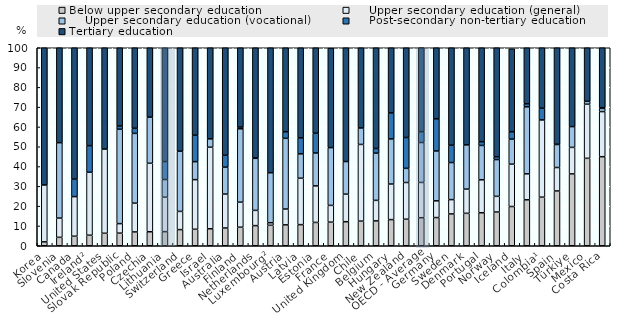
| Category | Below upper secondary education |     Upper secondary education (general) |     Upper secondary education (vocational) |     Post-secondary non-tertiary education | Tertiary education |
|---|---|---|---|---|---|
| Korea | 1.968 | 28.743 | 0 | 0 | 69.289 |
| Slovenia | 4.25 | 9.73 | 38.07 | 0 | 47.95 |
| Canada | 4.809 | 20.008 | 0 | 8.826 | 66.358 |
| Ireland² | 5.316 | 31.799 | 0 | 13.446 | 62.885 |
| United States | 6.298 | 42.535 | 0 | 0 | 51.168 |
| Slovak Republic | 6.364 | 4.807 | 47.673 | 1.658 | 39.497 |
| Poland | 6.981 | 14.524 | 35.243 | 2.607 | 40.645 |
| Czechia | 7.07 | 34.595 | 23.296 | 0 | 35.039 |
| Lithuania | 7.128 | 17.396 | 8.92 | 9.077 | 57.479 |
| Switzerland | 8.158 | 9.188 | 30.383 | 0 | 52.271 |
| Greece | 8.32 | 25.066 | 9.079 | 13.35 | 44.185 |
| Israel | 8.59 | 41.19 | 4.212 | 0 | 46.008 |
| Australia | 8.965 | 17.133 | 13.595 | 5.999 | 54.307 |
| Finland | 9.375 | 12.642 | 37.074 | 0.852 | 40.057 |
| Netherlands | 10.169 | 7.696 | 26.287 | 0.243 | 55.605 |
| Luxembourg² | 10.333 | 1.297 | 25.249 | 0 | 63.12 |
| Austria | 10.552 | 7.995 | 35.707 | 3.301 | 42.444 |
| Latvia | 10.662 | 23.455 | 12.309 | 8.069 | 45.504 |
| Estonia | 11.777 | 18.467 | 16.61 | 9.966 | 43.179 |
| France | 11.923 | 8.468 | 29.172 | 0 | 50.256 |
| United Kingdom | 12.137 | 13.924 | 16.465 | 0 | 57.473 |
| Chile | 12.436 | 38.737 | 8.319 | 0 | 40.508 |
| Belgium | 12.573 | 10.338 | 23.857 | 2.363 | 50.869 |
| Hungary | 13.208 | 17.969 | 22.774 | 13.134 | 32.915 |
| New Zealand | 13.407 | 18.543 | 7.15 | 15.583 | 45.317 |
| OECD - Average | 14.158 | 17.807 | 20.166 | 5.483 | 46.904 |
| Germany | 14.243 | 8.439 | 25.193 | 16.242 | 35.883 |
| Sweden | 16.08 | 7.22 | 18.72 | 8.761 | 49.219 |
| Denmark | 16.379 | 12.22 | 22.361 | 0 | 49.041 |
| Portugal | 16.67 | 16.643 | 17.349 | 1.884 | 47.454 |
| Norway | 17.034 | 7.919 | 18.571 | 1.441 | 55.035 |
| Iceland | 19.818 | 21.394 | 12.639 | 3.73 | 41.923 |
| Italy | 23.194 | 13.128 | 33.854 | 1.535 | 28.267 |
| Colombia¹ | 24.544 | 39.012 | 0 | 5.917 | 30.527 |
| Spain | 27.674 | 11.832 | 11.615 | 0.153 | 48.726 |
| Türkiye | 36.287 | 13.394 | 10.493 | 0 | 39.826 |
| Mexico | 44.155 | 27.329 | 1.459 | 0 | 27.056 |
| Costa Rica | 44.984 | 22.77 | 1.619 | 0.366 | 30.261 |